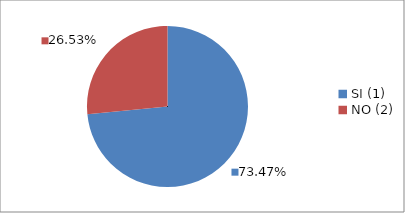
| Category | Series 0 |
|---|---|
| SI (1) | 0.735 |
| NO (2) | 0.265 |